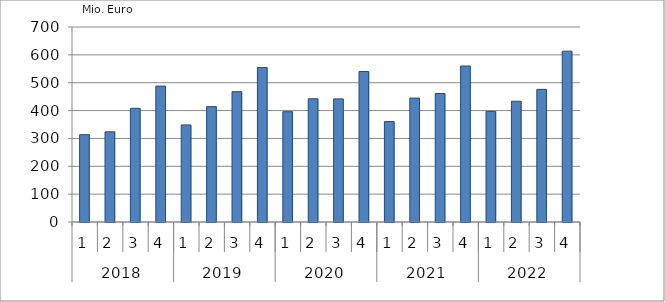
| Category | Ausbaugewerblicher Umsatz3 |
|---|---|
| 0 | 313433.569 |
| 1 | 323547.694 |
| 2 | 408057.42 |
| 3 | 487843.765 |
| 4 | 348466.115 |
| 5 | 414145.554 |
| 6 | 467849.207 |
| 7 | 554369.34 |
| 8 | 395996.128 |
| 9 | 442270.528 |
| 10 | 441987.109 |
| 11 | 540250.513 |
| 12 | 360578.959 |
| 13 | 444796.964 |
| 14 | 461290.095 |
| 15 | 559989.337 |
| 16 | 396959.135 |
| 17 | 433420.546 |
| 18 | 476099.112 |
| 19 | 613244.901 |